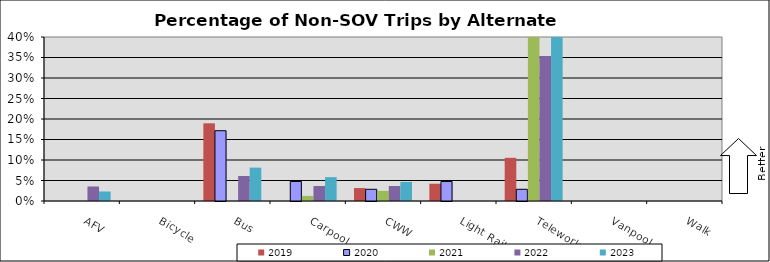
| Category | 2019 | 2020 | 2021 | 2022 | 2023 |
|---|---|---|---|---|---|
| AFV | 0 | 0 | 0 | 0.035 | 0.023 |
| Bicycle | 0 | 0 | 0 | 0 | 0 |
| Bus | 0.189 | 0.171 | 0 | 0.061 | 0.081 |
| Carpool | 0 | 0.048 | 0.012 | 0.037 | 0.058 |
| CWW | 0.032 | 0.029 | 0.025 | 0.037 | 0.047 |
| Light Rail | 0.042 | 0.048 | 0 | 0 | 0 |
| Telework | 0.105 | 0.029 | 0.728 | 0.354 | 0.5 |
| Vanpool | 0 | 0 | 0 | 0 | 0 |
| Walk | 0 | 0 | 0 | 0 | 0 |